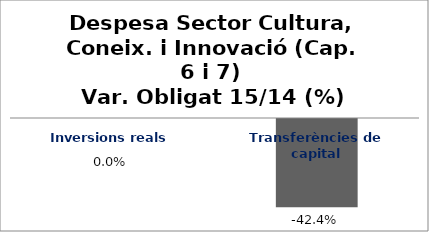
| Category | Series 0 |
|---|---|
| Inversions reals | 0 |
| Transferències de capital | -0.424 |